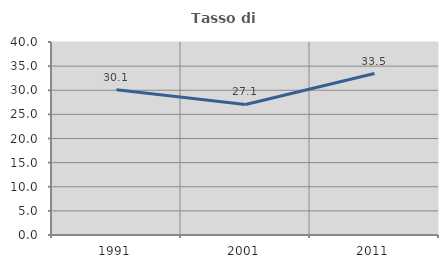
| Category | Tasso di occupazione   |
|---|---|
| 1991.0 | 30.102 |
| 2001.0 | 27.063 |
| 2011.0 | 33.461 |